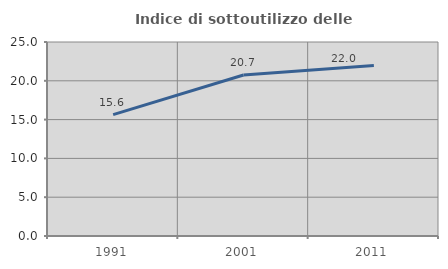
| Category | Indice di sottoutilizzo delle abitazioni  |
|---|---|
| 1991.0 | 15.643 |
| 2001.0 | 20.744 |
| 2011.0 | 21.97 |